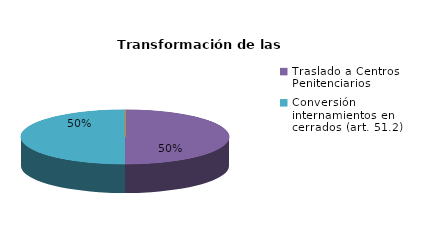
| Category | Series 0 |
|---|---|
| Reducciones y sustituciones (arts. 13 y 51) | 0 |
| Por quebrantamiento (art. 50.2) | 0 |
| Cancelaciones anticipadas | 0 |
| Traslado a Centros Penitenciarios | 1 |
| Conversión internamientos en cerrados (art. 51.2) | 1 |